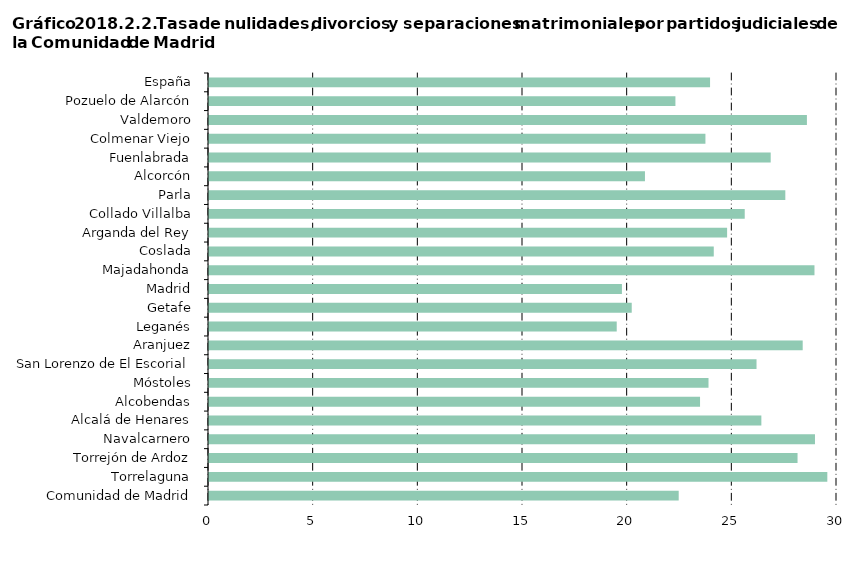
| Category | Series 0 |
|---|---|
| Comunidad de Madrid | 22.438 |
|     Torrelaguna | 29.538 |
|     Torrejón de Ardoz | 28.115 |
|     Navalcarnero | 28.948 |
|     Alcalá de Henares | 26.387 |
|     Alcobendas | 23.458 |
|     Móstoles | 23.862 |
|     San Lorenzo de El Escorial | 26.156 |
|     Aranjuez | 28.361 |
|     Leganés | 19.477 |
|     Getafe | 20.194 |
|     Madrid | 19.725 |
|     Majadahonda | 28.924 |
|     Coslada | 24.113 |
|     Arganda del Rey | 24.751 |
|     Collado Villalba | 25.592 |
|     Parla | 27.531 |
|     Alcorcón | 20.826 |
|     Fuenlabrada | 26.833 |
|     Colmenar Viejo | 23.714 |
|     Valdemoro | 28.563 |
|     Pozuelo de Alarcón | 22.281 |
| España | 23.936 |